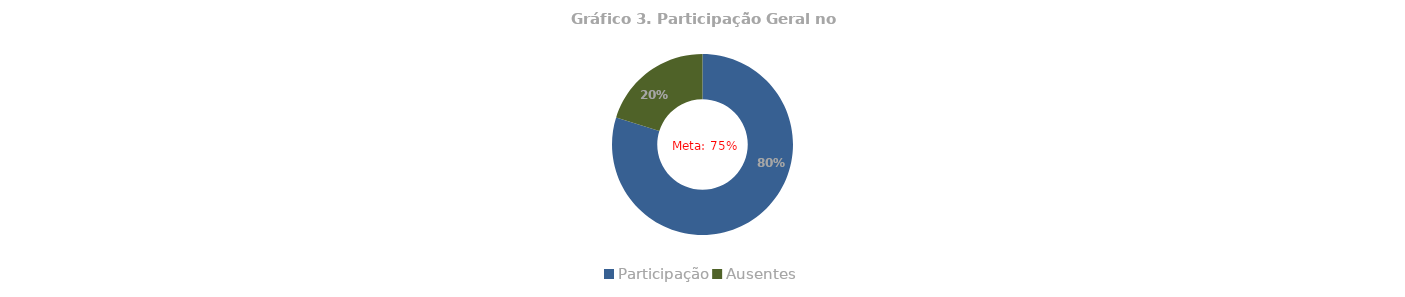
| Category | Series 1 |
|---|---|
| Participação | 0.798 |
| Ausentes | 0.202 |